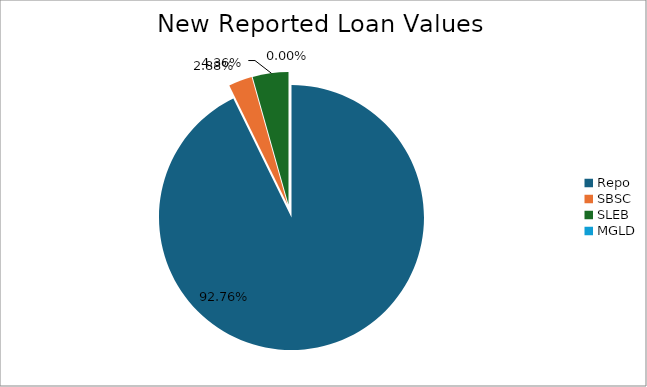
| Category | Series 0 |
|---|---|
| Repo | 9254307.075 |
| SBSC | 286926.14 |
| SLEB | 434958.117 |
| MGLD | 48.27 |